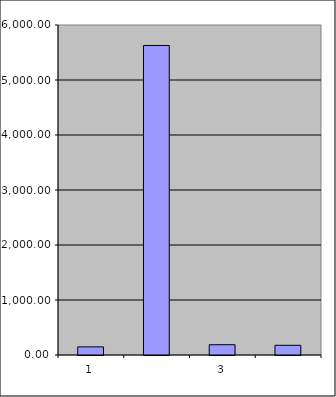
| Category | Series 0 |
|---|---|
| 0 | 147.5 |
| 1 | 5627.392 |
| 2 | 186.752 |
| 3 | 176.646 |